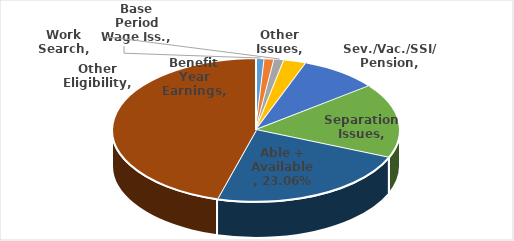
| Category | Series 0 |
|---|---|
| Base Period Wage Iss. | 0.01 |
| Other Issues | 0.011 |
| Work Search | 0.011 |
| Other Eligibility | 0.025 |
| Sev./Vac./SSI/ Pension | 0.088 |
| Separation Issues | 0.168 |
| Able + Available | 0.231 |
| Benefit Year Earnings | 0.456 |